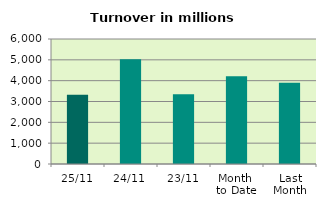
| Category | Series 0 |
|---|---|
| 25/11 | 3322.748 |
| 24/11 | 5024.662 |
| 23/11 | 3344.573 |
| Month 
to Date | 4210.377 |
| Last
Month | 3895.685 |